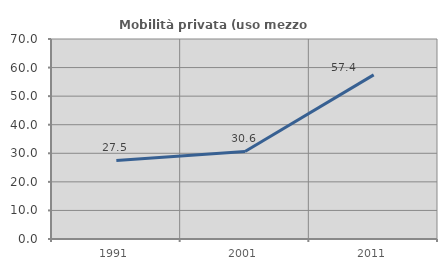
| Category | Mobilità privata (uso mezzo privato) |
|---|---|
| 1991.0 | 27.477 |
| 2001.0 | 30.636 |
| 2011.0 | 57.447 |